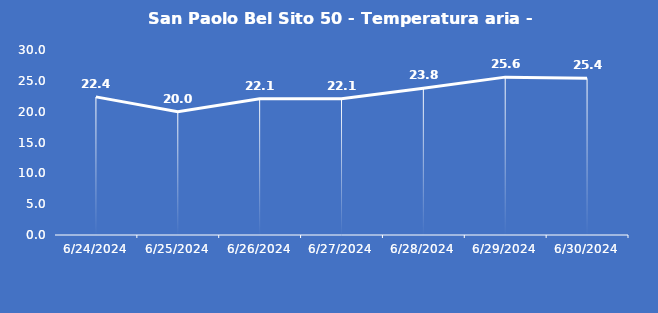
| Category | San Paolo Bel Sito 50 - Temperatura aria - Grezzo (°C) |
|---|---|
| 6/24/24 | 22.4 |
| 6/25/24 | 20 |
| 6/26/24 | 22.1 |
| 6/27/24 | 22.1 |
| 6/28/24 | 23.8 |
| 6/29/24 | 25.6 |
| 6/30/24 | 25.4 |